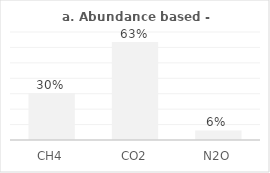
| Category | Series 0 |
|---|---|
| CH4 | 0.304 |
| CO2 | 0.635 |
| N2O | 0.062 |